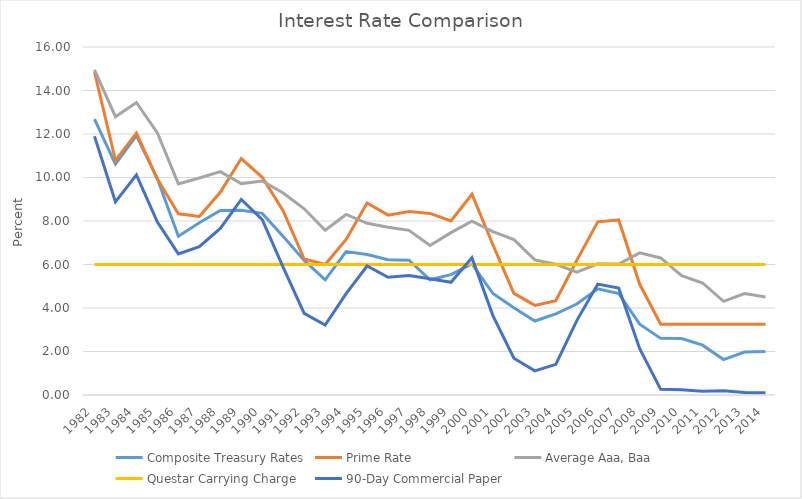
| Category | Composite Treasury Rates | Prime Rate | Average Aaa, Baa | Questar Carrying Charge | 90-Day Commercial Paper |
|---|---|---|---|---|---|
| 1982.0 | 12.68 | 14.85 | 14.95 | 6 | 11.9 |
| 1983.0 | 10.62 | 10.79 | 12.795 | 6 | 8.88 |
| 1984.0 | 11.927 | 12.04 | 13.45 | 6 | 10.12 |
| 1985.0 | 9.943 | 9.93 | 12.045 | 6 | 7.95 |
| 1986.0 | 7.3 | 8.33 | 9.705 | 6 | 6.49 |
| 1987.0 | 7.917 | 8.21 | 9.98 | 6 | 6.82 |
| 1988.0 | 8.487 | 9.32 | 10.27 | 6 | 7.66 |
| 1989.0 | 8.49 | 10.87 | 9.72 | 6 | 8.99 |
| 1990.0 | 8.35 | 10.01 | 9.84 | 6 | 8.06 |
| 1991.0 | 7.287 | 8.46 | 9.285 | 6 | 5.87 |
| 1992.0 | 6.19 | 6.25 | 8.56 | 6 | 3.75 |
| 1993.0 | 5.297 | 6 | 7.575 | 6 | 3.22 |
| 1994.0 | 6.593 | 7.15 | 8.3 | 6 | 4.66 |
| 1995.0 | 6.463 | 8.83 | 7.895 | 6 | 5.93 |
| 1996.0 | 6.223 | 8.27 | 7.71 | 6 | 5.41 |
| 1997.0 | 6.197 | 8.44 | 7.57 | 6 | 5.49 |
| 1998.0 | 5.297 | 8.35 | 6.875 | 6 | 5.34 |
| 1999.0 | 5.533 | 8 | 7.465 | 6 | 5.18 |
| 2000.0 | 6.027 | 9.23 | 7.995 | 6 | 6.31 |
| 2001.0 | 4.667 | 6.91 | 7.515 | 6 | 3.65 |
| 2002.0 | 4.013 | 4.67 | 7.145 | 6 | 1.69 |
| 2003.0 | 3.403 | 4.12 | 6.21 | 6 | 1.11 |
| 2004.0 | 3.733 | 4.34 | 6.01 | 6 | 1.41 |
| 2005.0 | 4.183 | 6.19 | 5.645 | 6 | 3.42 |
| 2006.0 | 4.883 | 7.96 | 6.035 | 6 | 5.1 |
| 2007.0 | 4.667 | 8.05 | 6.02 | 6 | 4.92 |
| 2008.0 | 3.257 | 5.09 | 6.535 | 6 | 2.13 |
| 2009.0 | 2.603 | 3.25 | 6.3 | 6 | 0.26 |
| 2010.0 | 2.597 | 3.25 | 5.49 | 6 | 0.24 |
| 2011.0 | 2.29 | 3.25 | 5.15 | 6 | 0.17 |
| 2012.0 | 1.63 | 3.25 | 4.305 | 6 | 0.19 |
| 2013.0 | 1.977 | 3.25 | 4.665 | 6 | 0.11 |
| 2014.0 | 2 | 3.25 | 4.505 | 6 | 0.1 |